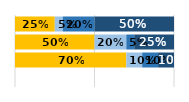
| Category | Niveles de desempeño | Series 1 | Series 2 | Series 3 |
|---|---|---|---|---|
| 0 | 0.25 | 0.05 | 0.2 | 0.5 |
| 1 | 0.5 | 0.2 | 0.05 | 0.25 |
| 2 | 0.7 | 0.1 | 0.1 | 0.1 |
| 3 | 0 | 0 | 0 | 0 |